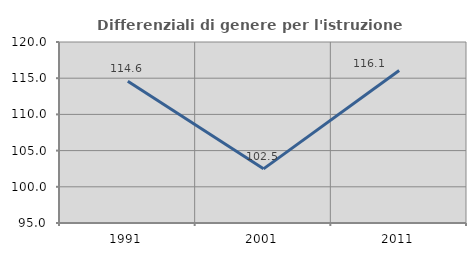
| Category | Differenziali di genere per l'istruzione superiore |
|---|---|
| 1991.0 | 114.59 |
| 2001.0 | 102.48 |
| 2011.0 | 116.058 |